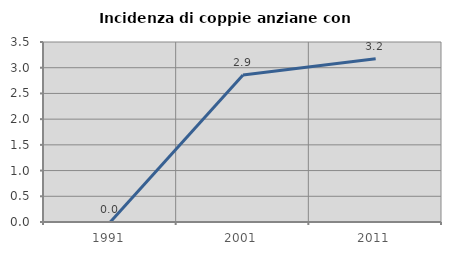
| Category | Incidenza di coppie anziane con figli |
|---|---|
| 1991.0 | 0 |
| 2001.0 | 2.857 |
| 2011.0 | 3.175 |